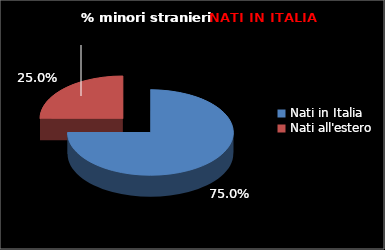
| Category | Series 0 |
|---|---|
| Nati in Italia | 57 |
| Nati all'estero | 19 |